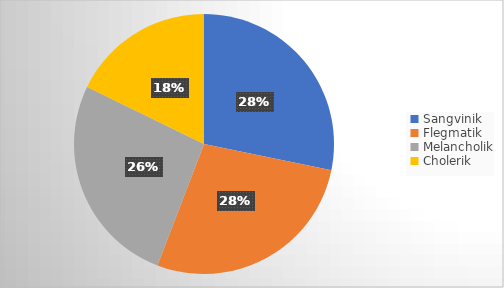
| Category | Series 0 |
|---|---|
| Sangvinik | 46 |
| Flegmatik | 45 |
| Melancholik | 43 |
| Cholerik | 29 |